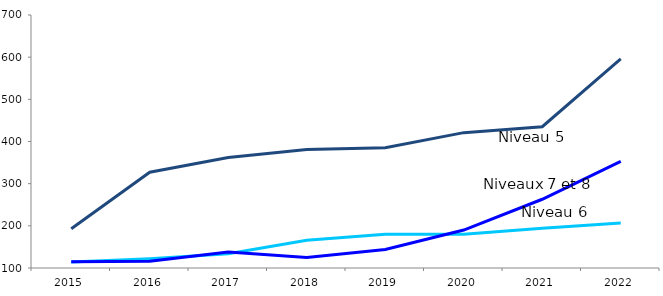
| Category | Niveaux 7 et 8 | Niveau 6 | Niveau 5 |
|---|---|---|---|
| 2015 | 114 | 115 | 193 |
| 2016 | 122 | 116 | 327 |
| 2017 | 134 | 138 | 362 |
| 2018 | 166 | 125 | 381 |
| 2019 | 180 | 144 | 385 |
| 2020 | 180 | 190 | 421 |
| 2021 | 194 | 263 | 435 |
| 2022 | 207 | 353 | 596 |